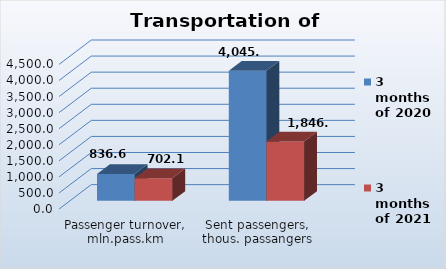
| Category | 3 months of 2020 | 3 months of 2021 |
|---|---|---|
| Passenger turnover, mln.pass.km | 836.6 | 702.1 |
| Sent passengers, thous. passangers | 4045.9 | 1846.7 |